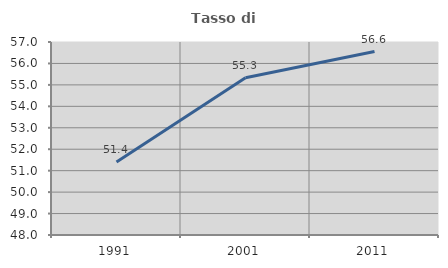
| Category | Tasso di occupazione   |
|---|---|
| 1991.0 | 51.401 |
| 2001.0 | 55.333 |
| 2011.0 | 56.554 |